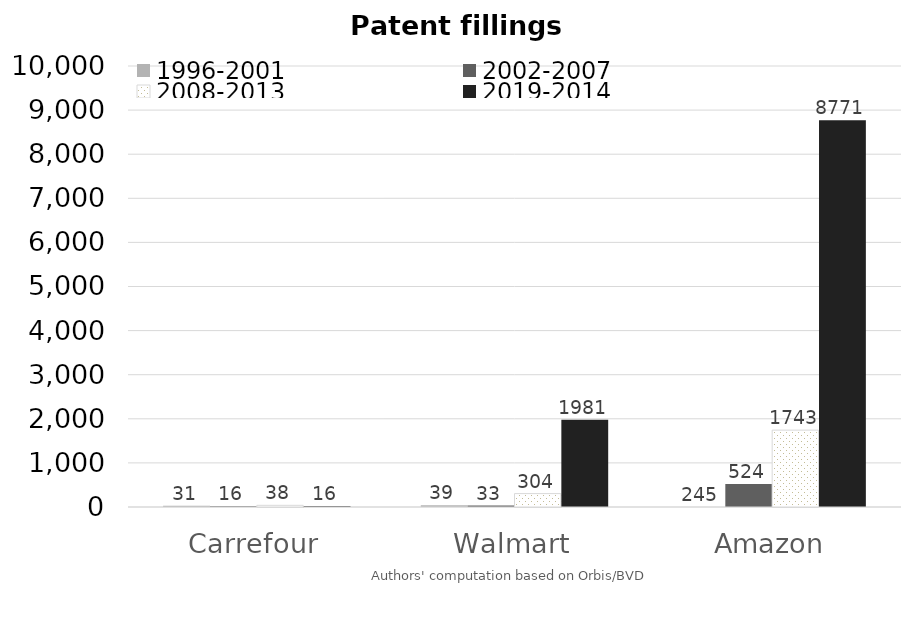
| Category | 1996-2001 | 2002-2007 | 2008-2013 | 2019-2014 |
|---|---|---|---|---|
| Carrefour | 31 | 16 | 38 | 16 |
| Walmart | 39 | 33 | 304 | 1981 |
| Amazon | 245 | 524 | 1743 | 8771 |